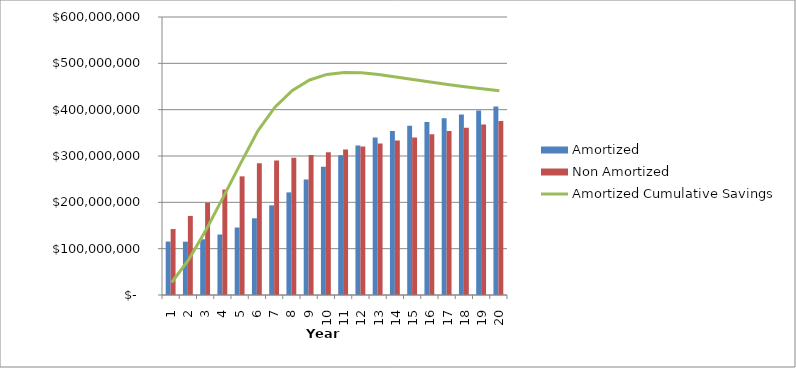
| Category | Amortized | Non Amortized |
|---|---|---|
| 0 | 115279760.498 | 142260000 |
| 1 | 115131116.364 | 170712000 |
| 2 | 120277734.585 | 199164000 |
| 3 | 130521356.981 | 227616000 |
| 4 | 145663725.37 | 256068000 |
| 5 | 165506581.571 | 284520000 |
| 6 | 193533955.438 | 290210400 |
| 7 | 221481220.627 | 296014608 |
| 8 | 249330185.619 | 301934900.16 |
| 9 | 277062295.06 | 307973598.163 |
| 10 | 301660818.102 | 314133070.126 |
| 11 | 322593315.421 | 320415731.529 |
| 12 | 340038354.111 | 326824046.16 |
| 13 | 354174107.443 | 333360527.083 |
| 14 | 365178346.991 | 340027737.624 |
| 15 | 373228434.594 | 346828292.377 |
| 16 | 381439523.95 | 353764858.224 |
| 17 | 389814835.092 | 360840155.389 |
| 18 | 398357652.458 | 368056958.497 |
| 19 | 407071326.171 | 375418097.667 |